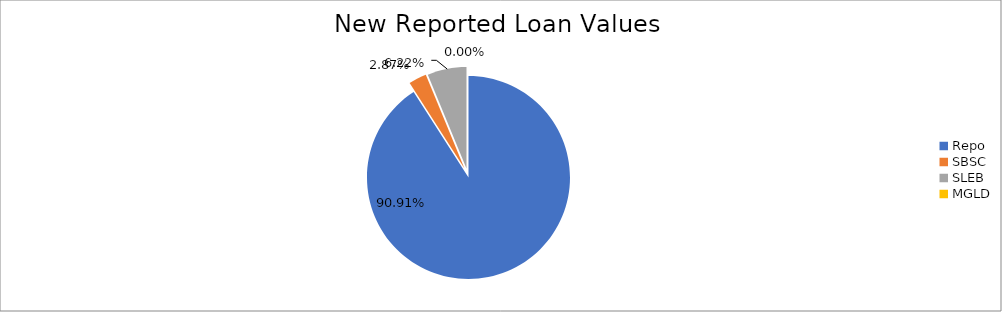
| Category | Series 0 |
|---|---|
| Repo | 8845106.688 |
| SBSC | 279001.019 |
| SLEB | 605394.162 |
| MGLD | 69.079 |